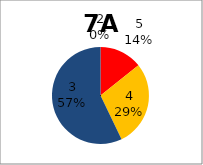
| Category | Series 0 |
|---|---|
| 5.0 | 1 |
| 4.0 | 2 |
| 3.0 | 4 |
| 2.0 | 0 |